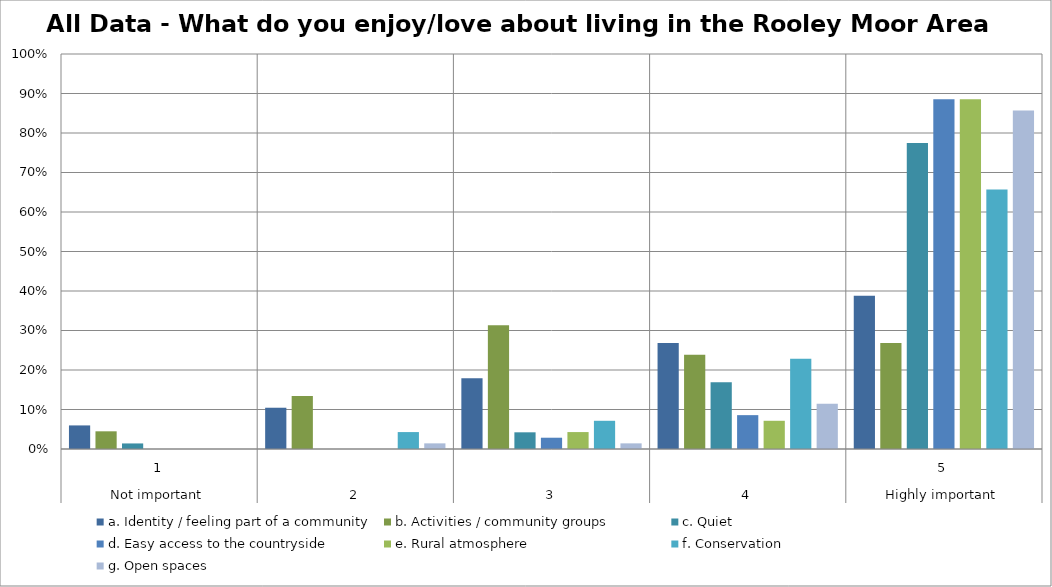
| Category | a. Identity / feeling part of a community | b. Activities / community groups | c. Quiet | d. Easy access to the countryside | e. Rural atmosphere | f. Conservation | g. Open spaces |
|---|---|---|---|---|---|---|---|
| 0 | 0.06 | 0.045 | 0.014 | 0 | 0 | 0 | 0 |
| 1 | 0.104 | 0.134 | 0 | 0 | 0 | 0.043 | 0.014 |
| 2 | 0.179 | 0.313 | 0.042 | 0.029 | 0.043 | 0.071 | 0.014 |
| 3 | 0.269 | 0.239 | 0.169 | 0.086 | 0.071 | 0.229 | 0.114 |
| 4 | 0.388 | 0.269 | 0.775 | 0.886 | 0.886 | 0.657 | 0.857 |